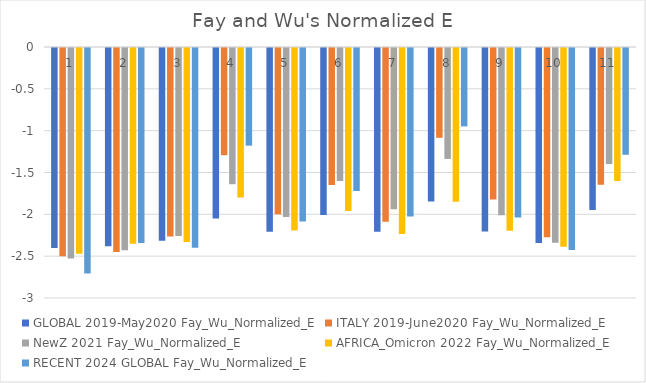
| Category | GLOBAL 2019-May2020 | ITALY 2019-June2020 | NewZ 2021 | AFRICA_Omicron 2022 | RECENT 2024 GLOBAL |
|---|---|---|---|---|---|
| 0 | -2.392 | -2.488 | -2.516 | -2.46 | -2.694 |
| 1 | -2.369 | -2.437 | -2.417 | -2.339 | -2.329 |
| 2 | -2.303 | -2.252 | -2.246 | -2.318 | -2.388 |
| 3 | -2.037 | -1.281 | -1.63 | -1.786 | -1.167 |
| 4 | -2.195 | -1.986 | -2.019 | -2.18 | -2.075 |
| 5 | -1.995 | -1.637 | -1.589 | -1.95 | -1.71 |
| 6 | -2.196 | -2.076 | -1.926 | -2.222 | -2.013 |
| 7 | -1.834 | -1.073 | -1.326 | -1.839 | -0.937 |
| 8 | -2.192 | -1.812 | -1.998 | -2.186 | -2.025 |
| 9 | -2.332 | -2.261 | -2.327 | -2.374 | -2.413 |
| 10 | -1.937 | -1.636 | -1.388 | -1.588 | -1.276 |